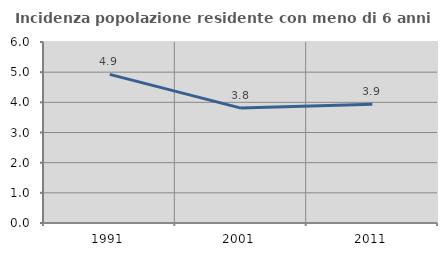
| Category | Incidenza popolazione residente con meno di 6 anni |
|---|---|
| 1991.0 | 4.926 |
| 2001.0 | 3.809 |
| 2011.0 | 3.936 |